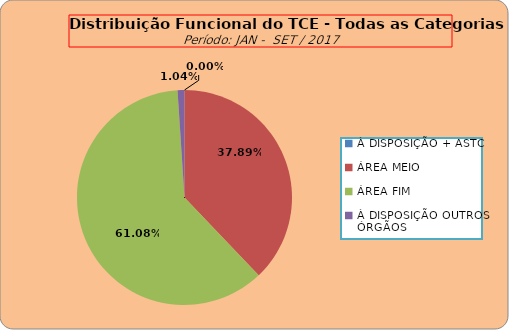
| Category | Series 0 |
|---|---|
| À DISPOSIÇÃO + ASTC | 0 |
| ÁREA MEIO | 183 |
| ÁREA FIM | 295 |
| À DISPOSIÇÃO OUTROS ÓRGÃOS | 5 |